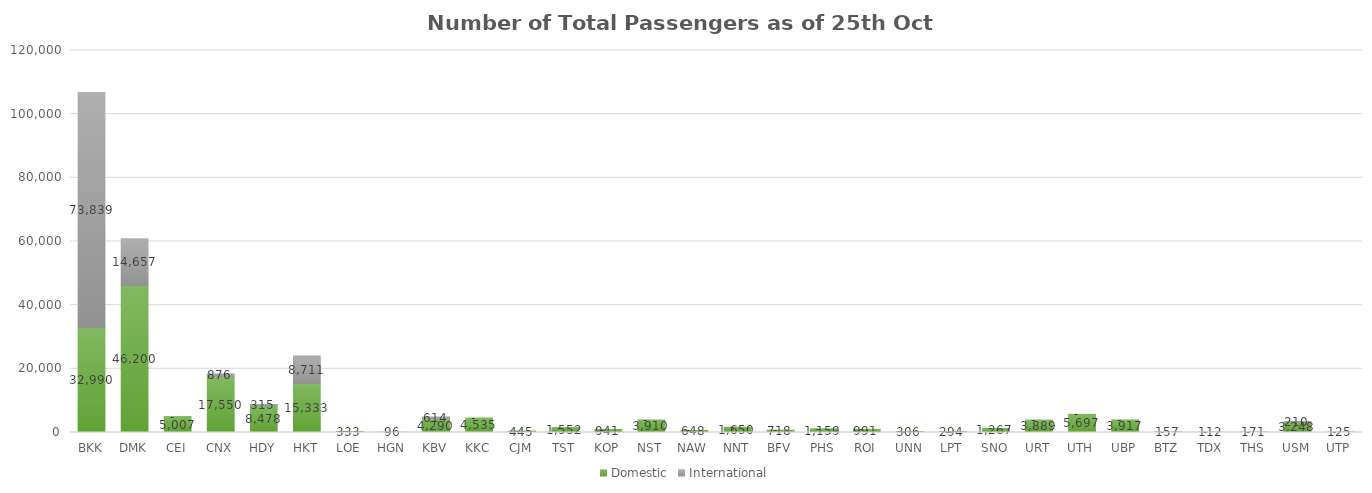
| Category | Domestic | International |
|---|---|---|
| BKK | 32990 | 73839 |
| DMK | 46200 | 14657 |
| CEI | 5007 | 0 |
| CNX | 17550 | 876 |
| HDY | 8478 | 315 |
| HKT | 15333 | 8711 |
| LOE | 333 | 0 |
| HGN | 96 | 0 |
| KBV | 4290 | 614 |
| KKC | 4535 | 0 |
| CJM | 445 | 0 |
| TST | 1552 | 0 |
| KOP | 941 | 0 |
| NST | 3910 | 0 |
| NAW | 648 | 0 |
| NNT | 1650 | 0 |
| BFV | 718 | 0 |
| PHS | 1159 | 0 |
| ROI | 991 | 0 |
| UNN | 306 | 0 |
| LPT | 294 | 0 |
| SNO | 1267 | 0 |
| URT | 3889 | 0 |
| UTH | 5697 | 0 |
| UBP | 3917 | 0 |
| BTZ | 157 | 0 |
| TDX | 112 | 0 |
| THS | 171 | 0 |
| USM | 3248 | 210 |
| UTP | 125 | 0 |